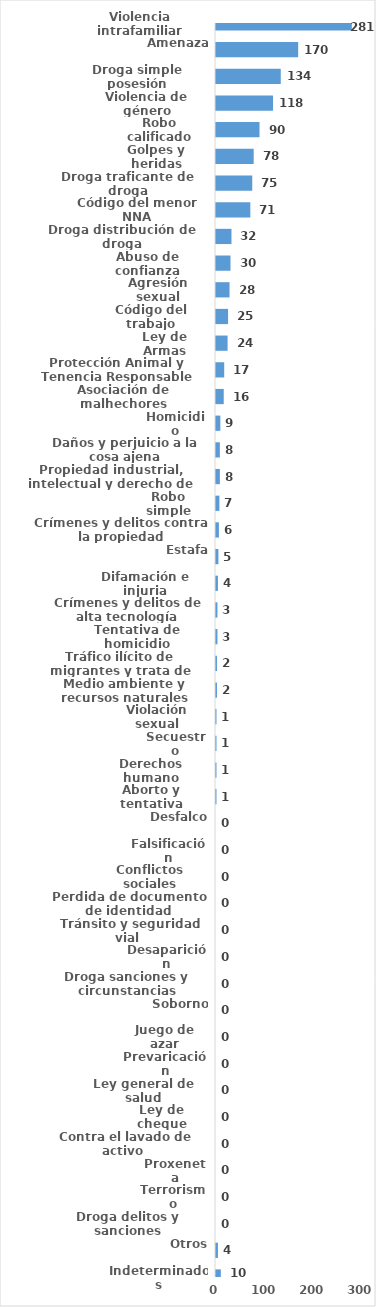
| Category | Series 0 |
|---|---|
| Violencia intrafamiliar | 281 |
| Amenaza | 170 |
| Droga simple posesión | 134 |
| Violencia de género | 118 |
| Robo calificado | 90 |
| Golpes y heridas | 78 |
| Droga traficante de droga | 75 |
| Código del menor NNA | 71 |
| Droga distribución de droga | 32 |
| Abuso de confianza | 30 |
| Agresión sexual | 28 |
| Código del trabajo | 25 |
| Ley de Armas | 24 |
| Protección Animal y Tenencia Responsable | 17 |
| Asociación de malhechores | 16 |
| Homicidio | 9 |
| Daños y perjuicio a la cosa ajena | 8 |
| Propiedad industrial, intelectual y derecho de autor | 8 |
| Robo simple | 7 |
| Crímenes y delitos contra la propiedad | 6 |
| Estafa | 5 |
| Difamación e injuria | 4 |
| Crímenes y delitos de alta tecnología | 3 |
| Tentativa de homicidio | 3 |
| Tráfico ilícito de migrantes y trata de personas | 2 |
| Medio ambiente y recursos naturales | 2 |
| Violación sexual | 1 |
| Secuestro | 1 |
| Derechos humano | 1 |
| Aborto y tentativa | 1 |
| Desfalco | 0 |
| Falsificación | 0 |
| Conflictos sociales | 0 |
| Perdida de documento de identidad | 0 |
| Tránsito y seguridad vial  | 0 |
| Desaparición | 0 |
| Droga sanciones y circunstancias agravantes | 0 |
| Soborno | 0 |
| Juego de azar | 0 |
| Prevaricación | 0 |
| Ley general de salud | 0 |
| Ley de cheque | 0 |
| Contra el lavado de activo  | 0 |
| Proxeneta | 0 |
| Terrorismo | 0 |
| Droga delitos y sanciones | 0 |
| Otros | 4 |
| Indeterminados | 10 |